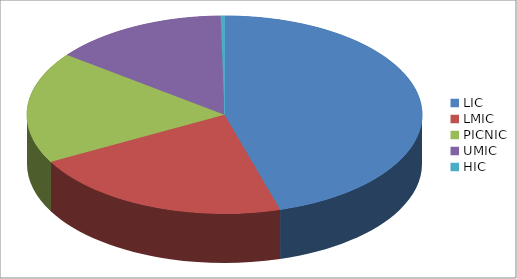
| Category | Series 0 |
|---|---|
| LIC | 6365342874 |
| LMIC | 3024831043 |
| PICNIC | 2558495586 |
| UMIC | 2008913340 |
| HIC | 43644553 |